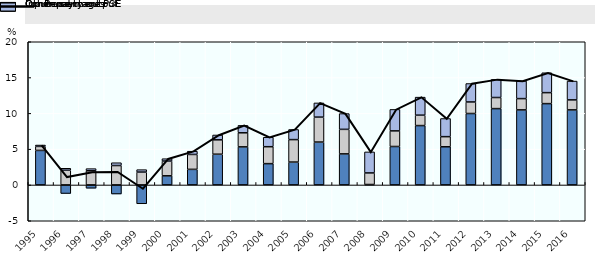
| Category | Commodity output | Input use | Other payments |
|---|---|---|---|
| 1995.0 | 4.823 | 0.559 | 0.195 |
| 1996.0 | -1.196 | 2.052 | 0.279 |
| 1997.0 | -0.457 | 1.978 | 0.301 |
| 1998.0 | -1.262 | 2.714 | 0.389 |
| 1999.0 | -2.628 | 1.797 | 0.34 |
| 2000.0 | 1.275 | 2.062 | 0.33 |
| 2001.0 | 2.179 | 2.082 | 0.454 |
| 2002.0 | 4.294 | 2.01 | 0.675 |
| 2003.0 | 5.318 | 1.965 | 1.037 |
| 2004.0 | 2.977 | 2.365 | 1.323 |
| 2005.0 | 3.194 | 3.139 | 1.414 |
| 2006.0 | 5.991 | 3.482 | 1.984 |
| 2007.0 | 4.338 | 3.428 | 2.203 |
| 2008.0 | 0.062 | 1.617 | 2.937 |
| 2009.0 | 5.372 | 2.18 | 2.999 |
| 2010.0 | 8.294 | 1.453 | 2.521 |
| 2011.0 | 5.33 | 1.416 | 2.533 |
| 2012.0 | 9.979 | 1.612 | 2.576 |
| 2013.0 | 10.663 | 1.55 | 2.531 |
| 2014.0 | 10.485 | 1.575 | 2.469 |
| 2015.0 | 11.36 | 1.533 | 2.779 |
| 2016.0 | 10.483 | 1.398 | 2.626 |